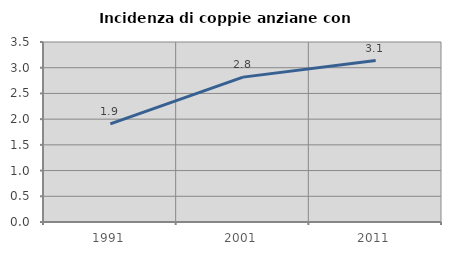
| Category | Incidenza di coppie anziane con figli |
|---|---|
| 1991.0 | 1.909 |
| 2001.0 | 2.817 |
| 2011.0 | 3.139 |